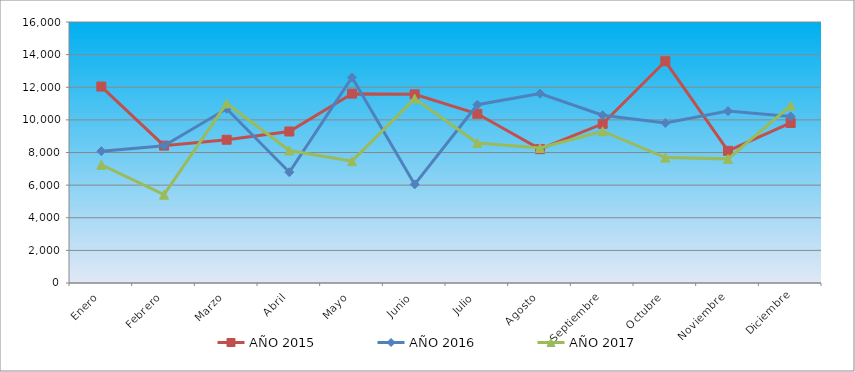
| Category | AÑO 2015 | AÑO 2016 | AÑO 2017 |
|---|---|---|---|
| Enero | 12042.123 | 8080.309 | 7250.242 |
| Febrero | 8421.765 | 8411.111 | 5415.225 |
| Marzo | 8780.93 | 10680.947 | 11010.102 |
| Abril | 9287.141 | 6791.493 | 8122.837 |
| Mayo | 11606.64 | 12601.591 | 7468.391 |
| Junio | 11566.069 | 6044.91 | 11305.245 |
| Julio | 10373.444 | 10927.801 | 8584.8 |
| Agosto | 8207.837 | 11608.155 | 8276.825 |
| Septiembre | 9758.294 | 10283.573 | 9303.408 |
| Octubre | 13592.597 | 9807.927 | 7686.54 |
| Noviembre | 8102.771 | 10536.447 | 7609.546 |
| Diciembre | 9812.725 | 10211.323 | 10868.947 |